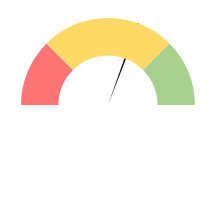
| Category | Series 1 |
|---|---|
| 0 | 0.608 |
| 1 | 0.01 |
| 2 | 1.382 |